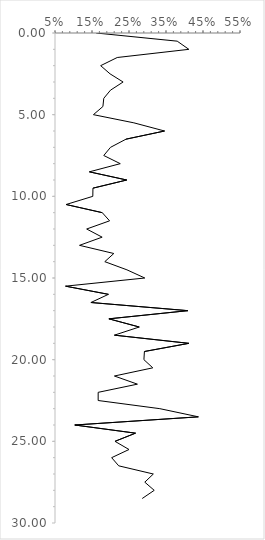
| Category | Series 0 |
|---|---|
| 0.16129032258064516 | 0 |
| 0.38028169014084506 | 0.5 |
| 0.4117647058823529 | 1 |
| 0.21818181818181817 | 1.5 |
| 0.17341040462427745 | 2 |
| 0.19875776397515527 | 2.5 |
| 0.23404255319148937 | 3 |
| 0.2 | 3.5 |
| 0.18181818181818182 | 4 |
| 0.1794871794871795 | 4.5 |
| 0.15384615384615385 | 5 |
| 0.2631578947368421 | 5.5 |
| 0.34615384615384615 | 6 |
| 0.24193548387096775 | 6.5 |
| 0.2 | 7 |
| 0.18181818181818182 | 7.5 |
| 0.22641509433962265 | 8 |
| 0.14285714285714285 | 8.5 |
| 0.24390243902439024 | 9 |
| 0.15254237288135594 | 9.5 |
| 0.15217391304347827 | 10 |
| 0.08 | 10.5 |
| 0.17777777777777778 | 11 |
| 0.19753086419753085 | 11.5 |
| 0.13559322033898305 | 12 |
| 0.1774193548387097 | 12.5 |
| 0.11627906976744186 | 13 |
| 0.208955223880597 | 13.5 |
| 0.18461538461538463 | 14 |
| 0.24444444444444444 | 14.5 |
| 0.2926829268292683 | 15 |
| 0.0784313725490196 | 15.5 |
| 0.19444444444444445 | 16 |
| 0.14705882352941177 | 16.5 |
| 0.4090909090909091 | 17 |
| 0.1956521739130435 | 17.5 |
| 0.2777777777777778 | 18 |
| 0.21052631578947367 | 18.5 |
| 0.4117647058823529 | 19 |
| 0.2916666666666667 | 19.5 |
| 0.2903225806451613 | 20 |
| 0.3142857142857143 | 20.5 |
| 0.21052631578947367 | 21 |
| 0.2727272727272727 | 21.5 |
| 0.16666666666666666 | 22 |
| 0.16666666666666666 | 22.5 |
| 0.3333333333333333 | 23 |
| 0.4375 | 23.5 |
| 0.10344827586206896 | 24 |
| 0.2676056338028169 | 24.5 |
| 0.21212121212121213 | 25 |
| 0.25 | 25.5 |
| 0.203125 | 26 |
| 0.2222222222222222 | 26.5 |
| 0.3157894736842105 | 27 |
| 0.2926829268292683 | 27.5 |
| 0.3181818181818182 | 28 |
| 0.2857142857142857 | 28.5 |